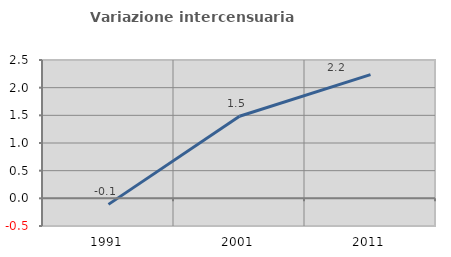
| Category | Variazione intercensuaria annua |
|---|---|
| 1991.0 | -0.109 |
| 2001.0 | 1.482 |
| 2011.0 | 2.235 |